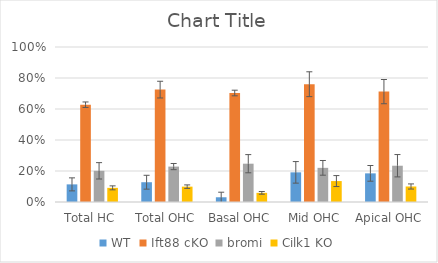
| Category | WT | Ift88 cKO | bromi | Cilk1 KO |
|---|---|---|---|---|
| Total HC | 0.114 | 0.628 | 0.201 | 0.091 |
| Total OHC | 0.128 | 0.725 | 0.228 | 0.099 |
| Basal OHC | 0.031 | 0.703 | 0.247 | 0.059 |
| Mid OHC | 0.191 | 0.76 | 0.22 | 0.135 |
| Apical OHC | 0.185 | 0.712 | 0.234 | 0.1 |